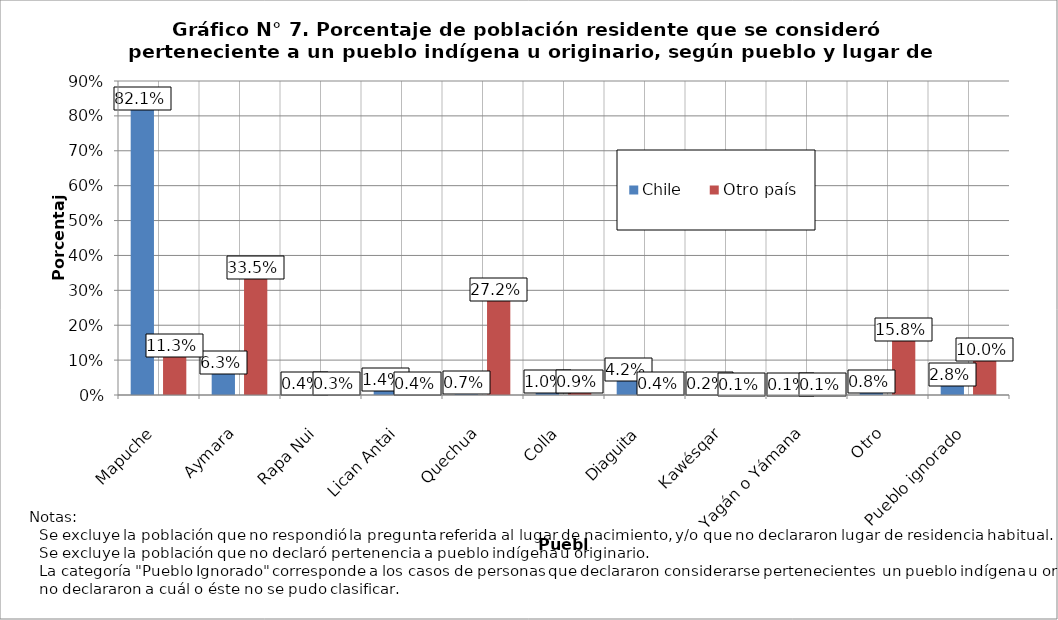
| Category | Chile | Otro país |
|---|---|---|
| Mapuche | 0.821 | 0.113 |
| Aymara | 0.063 | 0.335 |
| Rapa Nui | 0.004 | 0.003 |
| Lican Antai | 0.014 | 0.004 |
| Quechua | 0.007 | 0.272 |
| Colla | 0.01 | 0.009 |
| Diaguita | 0.042 | 0.004 |
| Kawésqar | 0.002 | 0.001 |
| Yagán o Yámana | 0.001 | 0.001 |
| Otro | 0.008 | 0.158 |
| Pueblo ignorado | 0.028 | 0.1 |